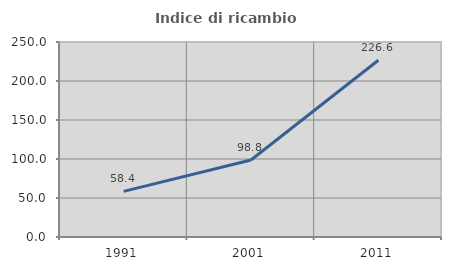
| Category | Indice di ricambio occupazionale  |
|---|---|
| 1991.0 | 58.442 |
| 2001.0 | 98.773 |
| 2011.0 | 226.606 |